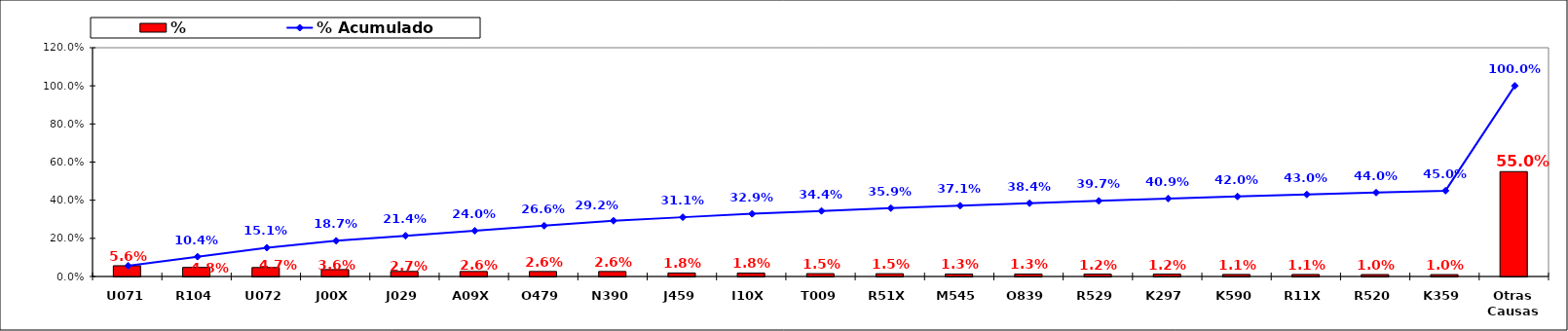
| Category | % |
|---|---|
| U071 | 0.056 |
| R104 | 0.048 |
| U072 | 0.047 |
| J00X | 0.036 |
| J029 | 0.027 |
| A09X | 0.026 |
| O479 | 0.026 |
| N390 | 0.026 |
| J459 | 0.018 |
| I10X | 0.018 |
| T009 | 0.015 |
| R51X | 0.015 |
| M545 | 0.013 |
| O839 | 0.013 |
| R529 | 0.012 |
| K297 | 0.012 |
| K590 | 0.011 |
| R11X | 0.011 |
| R520 | 0.01 |
| K359 | 0.01 |
| Otras Causas | 0.55 |